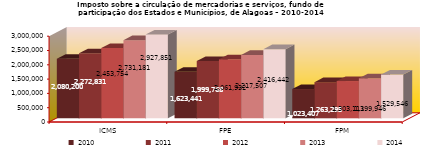
| Category | 2010 | 2011 | 2012 | 2013 | 2014 |
|---|---|---|---|---|---|
| ICMS | 2080200 | 2272831 | 2453754 | 2731181 | 2927851 |
| FPE | 1623441 | 1999768 | 2061932 | 2217507 | 2416442.255 |
| FPM | 1023407.322 | 1263295 | 1303111 | 1399946 | 1529545.825 |